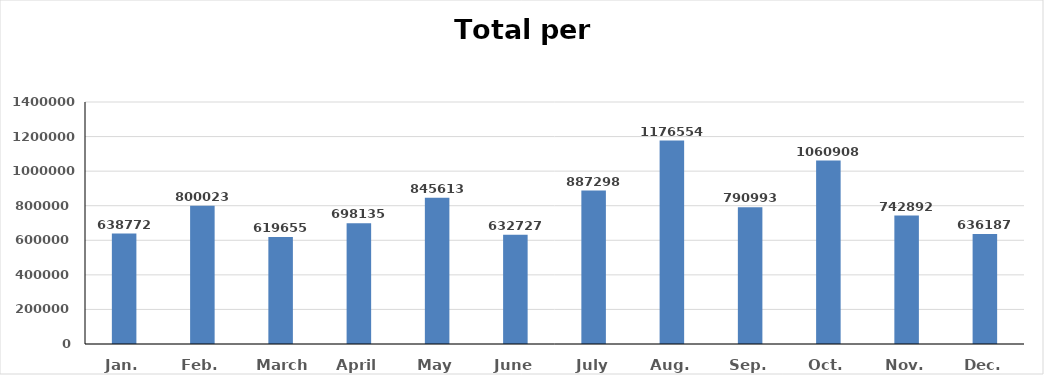
| Category | Series 0 |
|---|---|
| Jan. | 638772 |
| Feb. | 800023 |
| March | 619655 |
| April | 698135 |
| May | 845613 |
| June | 632727 |
| July | 887298 |
| Aug. | 1176554 |
| Sep. | 790993 |
| Oct. | 1060908 |
| Nov. | 742892 |
| Dec. | 636187 |